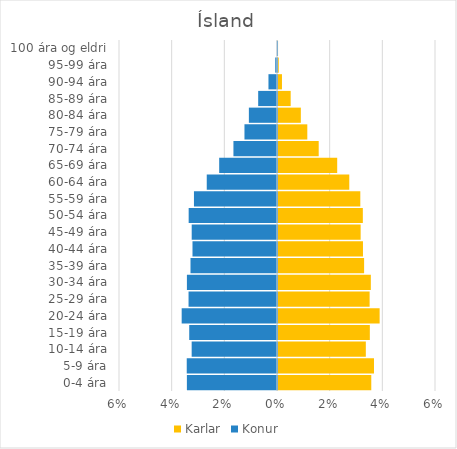
| Category | Karlar | Konur |
|---|---|---|
| 0-4 ára | 0.035 | -0.034 |
| 5-9 ára | 0.036 | -0.034 |
| 10-14 ára | 0.033 | -0.032 |
| 15-19 ára | 0.035 | -0.033 |
| 20-24 ára | 0.039 | -0.036 |
| 25-29 ára | 0.035 | -0.034 |
| 30-34 ára | 0.035 | -0.034 |
| 35-39 ára | 0.033 | -0.033 |
| 40-44 ára | 0.032 | -0.032 |
| 45-49 ára | 0.031 | -0.032 |
| 50-54 ára | 0.032 | -0.034 |
| 55-59 ára | 0.031 | -0.032 |
| 60-64 ára | 0.027 | -0.027 |
| 65-69 ára | 0.022 | -0.022 |
| 70-74 ára | 0.015 | -0.017 |
| 75-79 ára | 0.011 | -0.012 |
| 80-84 ára | 0.009 | -0.011 |
| 85-89 ára | 0.005 | -0.007 |
| 90-94 ára | 0.002 | -0.003 |
| 95-99 ára | 0 | -0.001 |
| 100 ára og eldri | 0 | 0 |